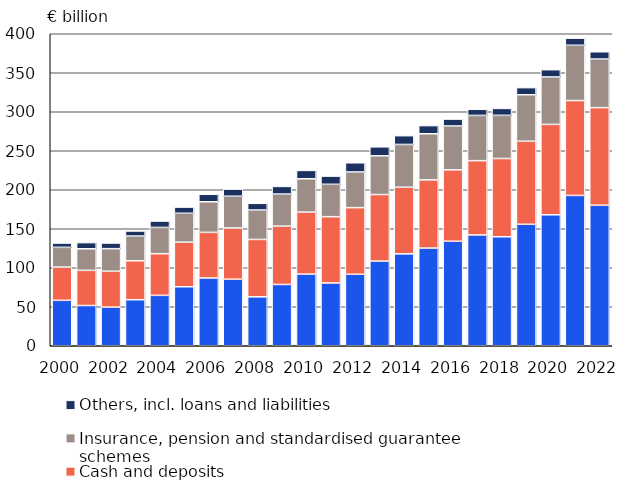
| Category | Shares and investments in mutual funds | Cash and deposits | Insurance, pension and standardised guarantee schemes | Others, incl. loans and liabilities |
|---|---|---|---|---|
| 2000.0 | 58.266 | 42.573 | 25.36 | 5.46 |
| 2001.0 | 51.618 | 45.069 | 27.649 | 7.907 |
| 2002.0 | 49.571 | 45.922 | 28.968 | 7.236 |
| 2003.0 | 59.026 | 49.971 | 31.663 | 6.481 |
| 2004.0 | 64.621 | 53.42 | 33.677 | 8.149 |
| 2005.0 | 75.676 | 57.148 | 37.042 | 7.902 |
| 2006.0 | 86.915 | 58.446 | 39.238 | 9.588 |
| 2007.0 | 85.372 | 65.625 | 40.738 | 9.072 |
| 2008.0 | 62.729 | 73.578 | 37.721 | 8.577 |
| 2009.0 | 78.583 | 74.795 | 41.097 | 9.798 |
| 2010.0 | 91.924 | 79.41 | 42.729 | 10.718 |
| 2011.0 | 80.487 | 84.979 | 41.506 | 10.538 |
| 2012.0 | 91.659 | 85.441 | 45.7 | 11.788 |
| 2013.0 | 108.584 | 85.28 | 49.639 | 11.548 |
| 2014.0 | 117.823 | 85.421 | 54.812 | 11.291 |
| 2015.0 | 125.278 | 87.372 | 59.129 | 10.484 |
| 2016.0 | 134.016 | 91.524 | 56.217 | 8.878 |
| 2017.0 | 142.073 | 95.232 | 57.996 | 7.854 |
| 2018.0 | 139.737 | 100.335 | 55.324 | 8.888 |
| 2019.0 | 155.747 | 106.494 | 59.495 | 9.21 |
| 2020.0 | 167.909 | 115.901 | 60.816 | 9.291 |
| 2021.0 | 192.756 | 121.598 | 70.875 | 9.14 |
| 2022.0 | 180.205 | 125.096 | 62.279 | 9.344 |